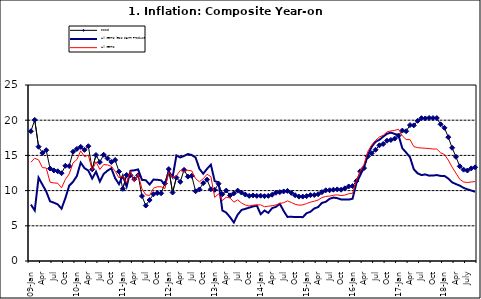
| Category | Food | All Items less Farm Produce | All Items |
|---|---|---|---|
| 09-Jan | 18.436 | 8.013 | 14.034 |
| Feb | 20.041 | 7.178 | 14.584 |
| Mar | 16.233 | 11.842 | 14.366 |
| Apr | 15.342 | 10.85 | 13.268 |
| May | 15.74 | 9.88 | 13.212 |
| June | 13.138 | 8.472 | 11.194 |
| Jul | 12.867 | 8.285 | 11.09 |
| Aug | 12.746 | 8.044 | 11.046 |
| Sep | 12.472 | 7.431 | 10.39 |
| Oct | 13.524 | 8.933 | 11.588 |
| Nov | 13.482 | 10.702 | 12.368 |
| Dec | 15.518 | 11.249 | 13.93 |
| 10-Jan | 15.918 | 12.063 | 14.398 |
| Feb | 16.208 | 13.978 | 15.649 |
| Mar | 15.79 | 13.184 | 14.812 |
| Apr | 16.306 | 12.844 | 15.044 |
| May | 13.023 | 11.711 | 12.915 |
| Jun | 15.053 | 12.686 | 14.099 |
| Jul | 14.043 | 11.287 | 13.002 |
| Aug | 15.09 | 12.366 | 13.702 |
| Sep | 14.57 | 12.83 | 13.65 |
| Oct | 14.065 | 13.168 | 13.45 |
| Nov | 14.351 | 11.746 | 12.766 |
| Dec | 12.701 | 10.917 | 11.815 |
| 11-Jan | 10.255 | 12.118 | 12.08 |
| Feb | 12.221 | 10.569 | 11.1 |
| Mar | 12.169 | 12.815 | 12.779 |
| Apr | 11.629 | 12.882 | 11.291 |
| May | 12.179 | 13.006 | 12.352 |
| Jun | 9.22 | 11.524 | 10.23 |
| Jul | 7.877 | 11.472 | 9.397 |
| Aug | 8.665 | 10.863 | 9.301 |
| Sep | 9.479 | 11.567 | 10.339 |
| Oct | 9.656 | 11.539 | 10.544 |
| Nov | 9.623 | 11.459 | 10.54 |
| Dec | 11.02 | 10.822 | 10.283 |
| 12-Jan | 13.053 | 12.748 | 12.626 |
| 12-Feb | 9.729 | 11.901 | 11.866 |
| 12-Mar | 11.848 | 14.995 | 12.111 |
| Apr | 11.246 | 14.703 | 12.866 |
| May | 12.942 | 14.926 | 12.688 |
| Jun | 11.991 | 15.199 | 12.892 |
| Jul | 12.093 | 15.045 | 12.797 |
| Aug | 9.91 | 14.714 | 11.689 |
| Sep | 10.164 | 13.101 | 11.253 |
| Oct | 11.064 | 12.398 | 11.693 |
| Nov | 11.553 | 13.092 | 12.32 |
| Dec | 10.199 | 13.685 | 11.981 |
| 13-Jan | 10.106 | 11.342 | 9.031 |
| Feb | 10.973 | 11.184 | 9.542 |
| Mar | 9.482 | 7.179 | 8.593 |
| Apr | 10.006 | 6.874 | 9.052 |
| May | 9.321 | 6.227 | 8.964 |
| Jun | 9.606 | 5.472 | 8.353 |
| Jul | 9.994 | 6.58 | 8.682 |
| Aug | 9.723 | 7.245 | 8.231 |
| Sep | 9.437 | 7.41 | 7.952 |
| Oct | 9.249 | 7.579 | 7.807 |
| Nov | 9.313 | 7.75 | 7.931 |
| Dec | 9.253 | 7.872 | 7.957 |
| 14-Jan | 9.271 | 6.648 | 7.977 |
| Feb | 9.207 | 7.166 | 7.707 |
| Mar | 9.254 | 6.836 | 7.783 |
| Apr | 9.414 | 7.508 | 7.851 |
| May | 9.698 | 7.693 | 7.965 |
| Jun | 9.776 | 8.122 | 8.167 |
| Jul | 9.878 | 7.116 | 8.281 |
| Aug | 9.959 | 6.264 | 8.534 |
| Sep | 9.676 | 6.278 | 8.317 |
| Oct | 9.343 | 6.252 | 8.06 |
| Nov | 9.144 | 6.255 | 7.927 |
| Dec | 9.152 | 6.225 | 7.978 |
| 15-Jan | 9.215 | 6.787 | 8.157 |
| Feb | 9.359 | 6.994 | 8.359 |
| Mar | 9.376 | 7.46 | 8.494 |
| Apr | 9.49 | 7.661 | 8.655 |
| May | 9.782 | 8.253 | 9.003 |
| Jun | 10.041 | 8.403 | 9.168 |
| Jul | 10.049 | 8.83 | 9.218 |
| Aug | 10.131 | 9.01 | 9.336 |
| Sep | 10.174 | 8.928 | 9.394 |
| Oct | 10.129 | 8.742 | 9.296 |
| Nov | 10.321 | 8.732 | 9.368 |
| Dec | 10.588 | 8.727 | 9.554 |
| 16-Jan | 10.642 | 8.841 | 9.617 |
| Feb | 11.348 | 11.041 | 11.379 |
| Mar | 12.745 | 12.17 | 12.775 |
| Apr | 13.194 | 13.352 | 13.721 |
| May | 14.861 | 15.054 | 15.577 |
| Jun | 15.302 | 16.224 | 16.48 |
| Jul | 15.799 | 16.929 | 17.127 |
| Aug | 16.427 | 17.208 | 17.609 |
| Sep | 16.622 | 17.666 | 17.852 |
| Oct | 17.09 | 18.067 | 18.33 |
| Nov | 17.191 | 18.241 | 18.476 |
| Dec | 17.388 | 18.052 | 18.547 |
| 17-Jan | 17.818 | 17.867 | 18.719 |
| Feb | 18.528 | 16.011 | 17.78 |
| Mar | 18.436 | 15.404 | 17.256 |
| Apr | 19.303 | 14.75 | 17.244 |
| May | 19.266 | 13.016 | 16.251 |
| Jun | 19.915 | 12.455 | 16.098 |
| Jul | 20.284 | 12.207 | 16.053 |
| Aug | 20.251 | 12.296 | 16.012 |
| Sep | 20.321 | 12.123 | 15.979 |
| Oct | 20.306 | 12.142 | 15.905 |
| Nov | 20.308 | 12.206 | 15.901 |
| Dec | 19.415 | 12.089 | 15.372 |
| 18-Jan | 18.919 | 12.09 | 15.127 |
| Feb | 17.588 | 11.707 | 14.33 |
| Mar | 16.08 | 11.181 | 13.337 |
| Apr | 14.799 | 10.92 | 12.482 |
| May | 13.448 | 10.71 | 11.608 |
| June | 12.977 | 10.387 | 11.231 |
| July | 12.85 | 10.183 | 11.142 |
| August | 13.158 | 10.015 | 11.227 |
| September | 13.309 | 9.838 | 11.284 |